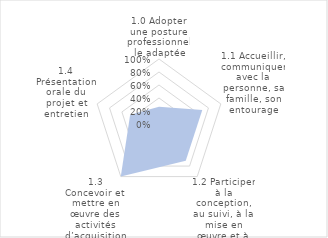
| Category | % |
|---|---|
| 0 | 0.267 |
| 1 | 0.7 |
| 2 | 0.7 |
| 3 | 1 |
| 4 | 0.467 |